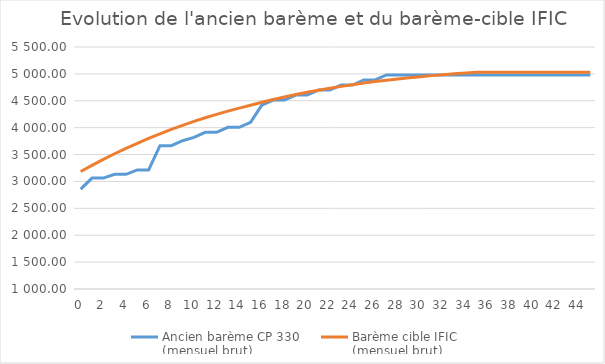
| Category | Ancien barème CP 330 
(mensuel brut) | Barème cible | Barème cible IFIC 
(mensuel brut) |
|---|---|---|---|
| 0.0 | 2857.11 |  | 3184.94 |
| 1.0 | 3062.85 |  | 3299.6 |
| 2.0 | 3062.85 |  | 3409.48 |
| 3.0 | 3133.13 |  | 3514.5 |
| 4.0 | 3133.13 |  | 3614.64 |
| 5.0 | 3215.12 |  | 3709.9 |
| 6.0 | 3215.12 |  | 3800.34 |
| 7.0 | 3664.08 |  | 3886.04 |
| 8.0 | 3664.08 |  | 3967.1 |
| 9.0 | 3757.32 |  | 4043.64 |
| 10.0 | 3819.47 |  | 4115.82 |
| 11.0 | 3912.71 |  | 4183.77 |
| 12.0 | 3912.71 |  | 4247.65 |
| 13.0 | 4005.95 |  | 4307.65 |
| 14.0 | 4005.95 |  | 4363.93 |
| 15.0 | 4099.18 |  | 4416.68 |
| 16.0 | 4420.34 |  | 4471.55 |
| 17.0 | 4513.58 |  | 4522.92 |
| 18.0 | 4513.58 |  | 4570.99 |
| 19.0 | 4606.81 |  | 4615.93 |
| 20.0 | 4606.81 |  | 4657.91 |
| 21.0 | 4700.05 |  | 4697.09 |
| 22.0 | 4700.05 |  | 4733.65 |
| 23.0 | 4793.29 |  | 4767.7 |
| 24.0 | 4793.29 |  | 4799.45 |
| 25.0 | 4886.53 |  | 4829.01 |
| 26.0 | 4886.53 |  | 4856.52 |
| 27.0 | 4979.76 |  | 4882.11 |
| 28.0 | 4979.76 |  | 4905.9 |
| 29.0 | 4979.76 |  | 4928.01 |
| 30.0 | 4979.76 |  | 4948.57 |
| 31.0 | 4979.76 |  | 4967.66 |
| 32.0 | 4979.76 |  | 4985.38 |
| 33.0 | 4979.76 |  | 5001.84 |
| 34.0 | 4979.76 |  | 5017.11 |
| 35.0 | 4979.76 |  | 5031.28 |
| 36.0 | 4979.76 |  | 5031.28 |
| 37.0 | 4979.76 |  | 5031.28 |
| 38.0 | 4979.76 |  | 5031.28 |
| 39.0 | 4979.76 |  | 5031.28 |
| 40.0 | 4979.76 |  | 5031.28 |
| 41.0 | 4979.76 |  | 5031.28 |
| 42.0 | 4979.76 |  | 5031.28 |
| 43.0 | 4979.76 |  | 5031.28 |
| 44.0 | 4979.76 |  | 5031.28 |
| 45.0 | 4979.76 |  | 5031.28 |